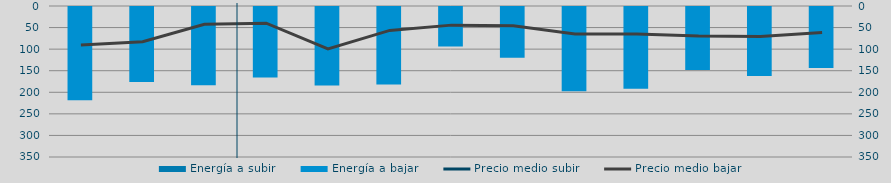
| Category | Energía a subir | Energía a bajar |
|---|---|---|
| O |  | 218.689 |
| N |  | 176.116 |
| D |  | 183.605 |
| E |  | 165.84 |
| F |  | 184.155 |
| M |  | 182.05 |
| A |  | 93.896 |
| M |  | 120.063 |
| J |  | 197.687 |
| J |  | 191.747 |
| A |  | 148.51 |
| S |  | 162.496 |
| O |  | 143.824 |